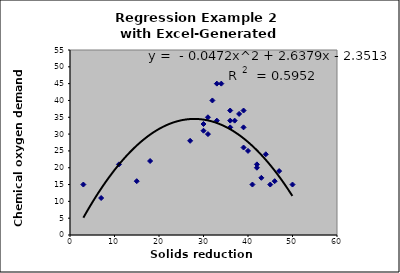
| Category | % chemical oxygen demand |
|---|---|
| 3.0 | 15 |
| 7.0 | 11 |
| 11.0 | 21 |
| 15.0 | 16 |
| 18.0 | 22 |
| 27.0 | 28 |
| 30.0 | 33 |
| 30.0 | 31 |
| 31.0 | 35 |
| 31.0 | 30 |
| 32.0 | 40 |
| 33.0 | 45 |
| 33.0 | 34 |
| 34.0 | 45 |
| 36.0 | 34 |
| 36.0 | 37 |
| 36.0 | 32 |
| 37.0 | 34 |
| 38.0 | 36 |
| 39.0 | 32 |
| 39.0 | 37 |
| 39.0 | 26 |
| 40.0 | 25 |
| 41.0 | 15 |
| 42.0 | 21 |
| 42.0 | 20 |
| 43.0 | 17 |
| 44.0 | 24 |
| 45.0 | 15 |
| 46.0 | 16 |
| 47.0 | 19 |
| 50.0 | 15 |